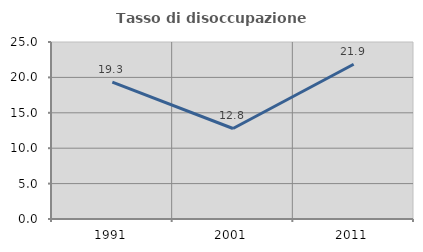
| Category | Tasso di disoccupazione giovanile  |
|---|---|
| 1991.0 | 19.346 |
| 2001.0 | 12.784 |
| 2011.0 | 21.853 |